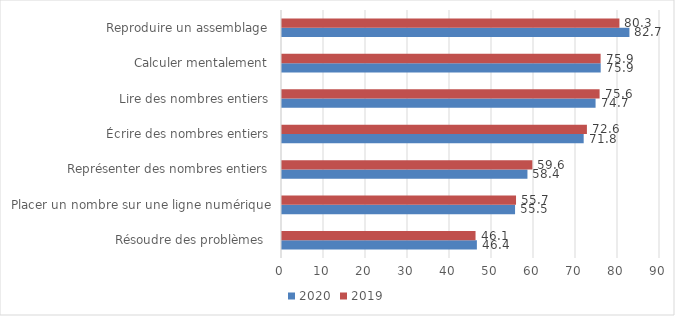
| Category | 2020 | 2019 |
|---|---|---|
| Résoudre des problèmes  | 46.4 | 46.08 |
| Placer un nombre sur une ligne numérique | 55.49 | 55.72 |
| Représenter des nombres entiers | 58.44 | 59.61 |
| Écrire des nombres entiers | 71.83 | 72.6 |
| Lire des nombres entiers | 74.66 | 75.62 |
| Calculer mentalement | 75.88 | 75.86 |
| Reproduire un assemblage | 82.72 | 80.34 |